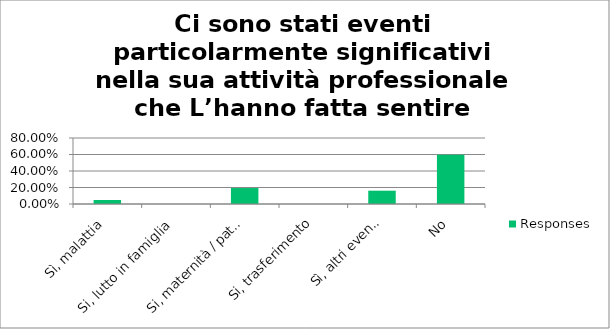
| Category | Responses |
|---|---|
| Sì, malattia | 0.048 |
| Si, lutto in famiglia | 0 |
| Si, maternità / paternità | 0.194 |
| Si, trasferimento | 0 |
| Sì, altri eventi | 0.161 |
| No | 0.597 |